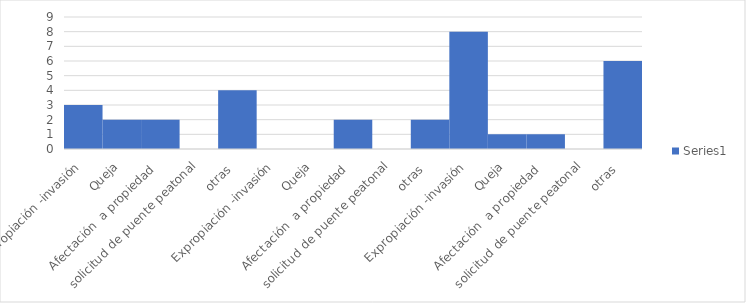
| Category | Series 0 |
|---|---|
| Expropiación -invasión | 3 |
| Queja | 2 |
| Afectación  a propiedad  | 2 |
| solicitud de puente peatonal | 0 |
| otras  | 4 |
| Expropiación -invasión | 0 |
| Queja | 0 |
| Afectación  a propiedad  | 2 |
| solicitud de puente peatonal | 0 |
| otras  | 2 |
| Expropiación -invasión | 8 |
| Queja | 1 |
| Afectación  a propiedad  | 1 |
| solicitud de puente peatonal | 0 |
| otras  | 6 |